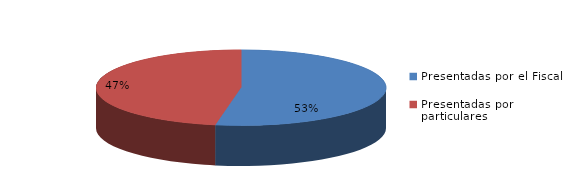
| Category | Series 0 |
|---|---|
| Presentadas por el Fiscal | 122 |
| Presentadas por particulares | 109 |